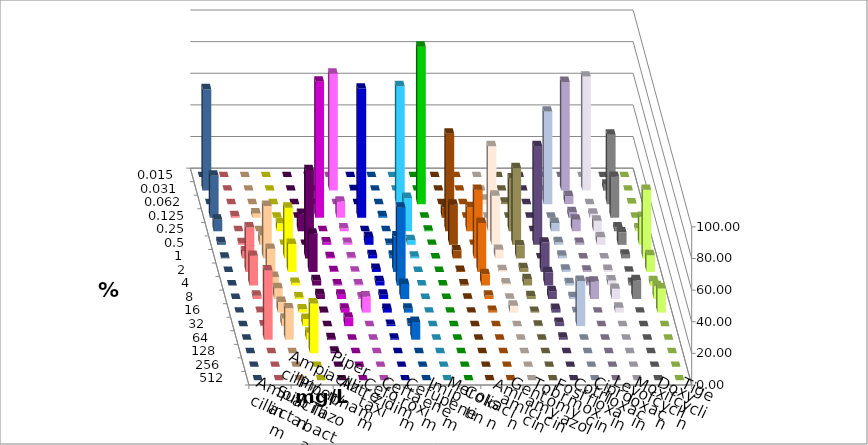
| Category | Ampicillin | Ampicillin/ Sulbactam | Piperacillin | Piperacillin/ Tazobactam | Aztreonam | Cefotaxim | Ceftazidim | Cefuroxim | Imipenem | Meropenem | Colistin | Amikacin | Gentamicin | Tobramycin | Fosfomycin | Cotrimoxazol | Ciprofloxacin | Levofloxacin | Moxifloxacin | Doxycyclin | Tigecyclin |
|---|---|---|---|---|---|---|---|---|---|---|---|---|---|---|---|---|---|---|---|---|---|
| 0.015 | 0 | 0 | 0 | 0 | 0 | 0 | 0 | 0 | 0 | 0 | 0 | 0 | 0 | 0 | 0 | 0 | 0 | 0 | 0 | 0 | 0 |
| 0.031 | 0 | 0 | 0 | 0 | 0 | 73.958 | 0.208 | 0 | 0 | 0 | 0 | 0 | 0 | 0 | 0 | 0 | 68.75 | 72.083 | 3.75 | 0 | 64.092 |
| 0.062 | 0 | 0 | 0 | 0 | 0 | 0 | 0 | 0 | 74.583 | 99.583 | 0 | 0 | 2.82 | 0.941 | 0 | 58.542 | 5.208 | 0 | 43.958 | 0.417 | 0 |
| 0.125 | 1.042 | 2.714 | 0 | 0 | 86.042 | 10.208 | 81.667 | 1.042 | 0.417 | 0 | 6.388 | 0 | 0 | 0 | 0 | 0 | 3.542 | 2.5 | 25.833 | 0 | 26.514 |
| 0.25 | 0 | 0 | 5 | 11.042 | 0 | 1.875 | 0 | 0 | 21.042 | 0.417 | 61.674 | 15.251 | 53.796 | 33.412 | 0 | 5.208 | 7.292 | 6.667 | 2.5 | 1.875 | 7.307 |
| 0.5 | 1.042 | 5.846 | 0 | 0 | 1.458 | 1.25 | 5 | 0.625 | 2.917 | 0 | 25.33 | 0 | 31.02 | 48.471 | 62.422 | 1.667 | 1.25 | 4.792 | 7.917 | 17.708 | 1.67 |
| 1.0 | 4.375 | 33.194 | 32.083 | 55.833 | 0.833 | 0.625 | 2.083 | 1.667 | 1.042 | 0 | 5.066 | 43.355 | 5.423 | 8.235 | 0 | 1.667 | 0 | 0 | 2.292 | 43.333 | 0.418 |
| 2.0 | 28.125 | 14.614 | 17.708 | 24.167 | 0.417 | 0.208 | 1.875 | 22.5 | 0 | 0 | 0.661 | 30.937 | 1.085 | 2.353 | 18.58 | 1.458 | 0.833 | 1.25 | 0.208 | 10.625 | 0 |
| 4.0 | 18.75 | 5.428 | 1.667 | 3.333 | 0.625 | 0.625 | 2.708 | 49.167 | 0 | 0 | 0.661 | 7.19 | 1.302 | 4 | 8.351 | 1.458 | 2.083 | 3.125 | 1.667 | 2.708 | 0 |
| 8.0 | 2.083 | 6.889 | 1.042 | 3.125 | 2.708 | 1.042 | 2.708 | 9.583 | 0 | 0 | 0.22 | 2.179 | 0.217 | 1.882 | 5.01 | 1.25 | 11.042 | 6.458 | 11.875 | 8.125 | 0 |
| 16.0 | 0.417 | 6.681 | 2.083 | 0.417 | 2.5 | 10.208 | 2.292 | 2.5 | 0 | 0 | 0 | 1.089 | 4.338 | 0.471 | 2.296 | 0.208 | 0 | 3.125 | 0 | 15.208 | 0 |
| 32.0 | 0.417 | 4.802 | 4.583 | 0 | 5.417 | 0 | 0.833 | 1.667 | 0 | 0 | 0 | 0 | 0 | 0.235 | 2.088 | 28.542 | 0 | 0 | 0 | 0 | 0 |
| 64.0 | 43.75 | 19.833 | 4.375 | 1.042 | 0 | 0 | 0.625 | 11.25 | 0 | 0 | 0 | 0 | 0 | 0 | 1.253 | 0 | 0 | 0 | 0 | 0 | 0 |
| 128.0 | 0 | 0 | 31.458 | 1.042 | 0 | 0 | 0 | 0 | 0 | 0 | 0 | 0 | 0 | 0 | 0 | 0 | 0 | 0 | 0 | 0 | 0 |
| 256.0 | 0 | 0 | 0 | 0 | 0 | 0 | 0 | 0 | 0 | 0 | 0 | 0 | 0 | 0 | 0 | 0 | 0 | 0 | 0 | 0 | 0 |
| 512.0 | 0 | 0 | 0 | 0 | 0 | 0 | 0 | 0 | 0 | 0 | 0 | 0 | 0 | 0 | 0 | 0 | 0 | 0 | 0 | 0 | 0 |